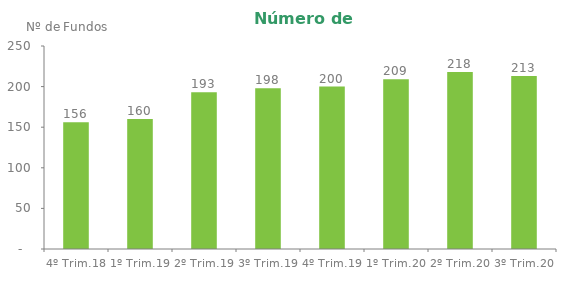
| Category | Series 0 |
|---|---|
| 4º Trim.18 | 156 |
| 1º Trim.19 | 160 |
| 2º Trim.19 | 193 |
| 3º Trim.19 | 198 |
| 4º Trim.19 | 200 |
| 1º Trim.20 | 209 |
| 2º Trim.20 | 218 |
| 3º Trim.20 | 213 |